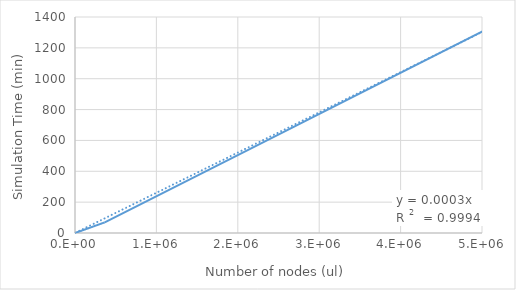
| Category | Series 0 |
|---|---|
| 5007729.0 | 1307 |
| 365710.0 | 69 |
| 53679.0 | 9.883 |
| 8129.0 | 2.783 |